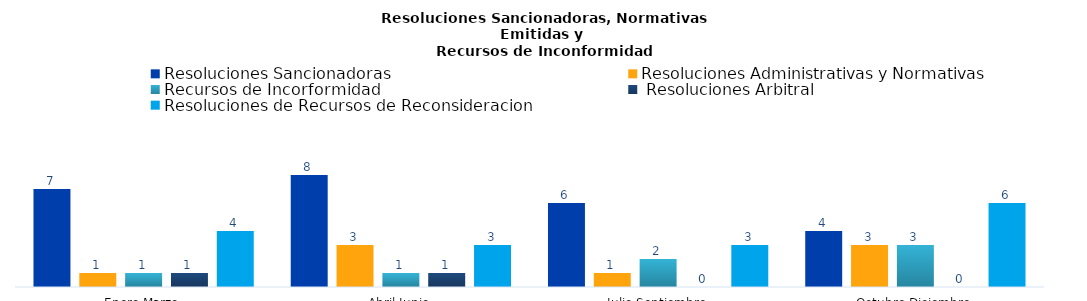
| Category | Resoluciones Sancionadoras | Resoluciones Administrativas y Normativas | Recursos de Incorformidad |  Resoluciones Arbitral | Resoluciones de Recursos de Reconsideracion |
|---|---|---|---|---|---|
| Enero-Marzo | 7 | 1 | 1 | 1 | 4 |
| Abril-Junio | 8 | 3 | 1 | 1 | 3 |
| Julio-Septiembre | 6 | 1 | 2 | 0 | 3 |
| Octubre-Diciembre | 4 | 3 | 3 | 0 | 6 |